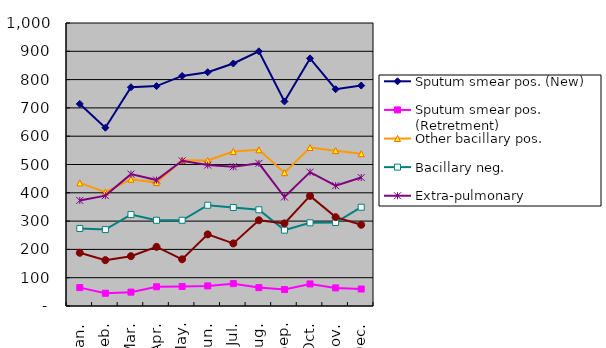
| Category | Sputum smear pos. (New) | Sputum smear pos. (Retretment) | Other bacillary pos. | Bacillary neg. | Extra-pulmonary | LTBI*  on treatment |
|---|---|---|---|---|---|---|
| Jan. | 714 | 65 | 435 | 274 | 373 | 188 |
| Feb. | 630 | 45 | 402 | 270 | 390 | 162 |
| Mar. | 773 | 49 | 448 | 323 | 466 | 176 |
| Apr. | 777 | 68 | 436 | 303 | 445 | 209 |
| May. | 813 | 69 | 515 | 303 | 513 | 165 |
| Jun. | 826 | 71 | 514 | 356 | 498 | 253 |
| Jul. | 857 | 79 | 546 | 348 | 492 | 221 |
| Aug. | 900 | 65 | 552 | 340 | 504 | 303 |
| Sep. | 723 | 58 | 471 | 268 | 385 | 292 |
| Oct. | 875 | 78 | 560 | 294 | 473 | 389 |
| Nov. | 766 | 64 | 549 | 295 | 425 | 314 |
| Dec. | 779 | 60 | 538 | 349 | 454 | 287 |